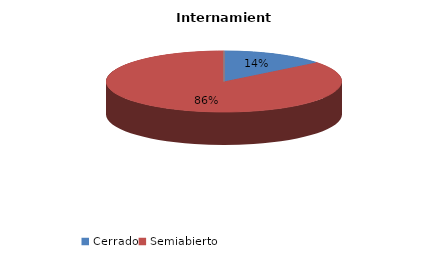
| Category | Series 0 |
|---|---|
| Cerrado | 2 |
| Semiabierto | 12 |
| Abierto | 0 |
| Terapeúticos | 0 |